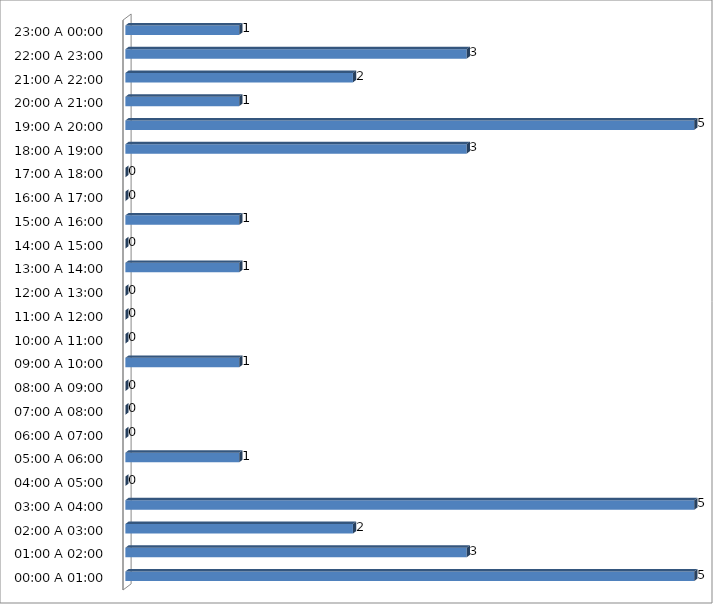
| Category | Series 0 |
|---|---|
| 00:00 A 01:00 | 5 |
| 01:00 A 02:00 | 3 |
| 02:00 A 03:00 | 2 |
| 03:00 A 04:00 | 5 |
| 04:00 A 05:00 | 0 |
| 05:00 A 06:00 | 1 |
| 06:00 A 07:00 | 0 |
| 07:00 A 08:00 | 0 |
| 08:00 A 09:00 | 0 |
| 09:00 A 10:00 | 1 |
| 10:00 A 11:00 | 0 |
| 11:00 A 12:00 | 0 |
| 12:00 A 13:00 | 0 |
| 13:00 A 14:00 | 1 |
| 14:00 A 15:00 | 0 |
| 15:00 A 16:00 | 1 |
| 16:00 A 17:00 | 0 |
| 17:00 A 18:00 | 0 |
| 18:00 A 19:00 | 3 |
| 19:00 A 20:00 | 5 |
| 20:00 A 21:00 | 1 |
| 21:00 A 22:00 | 2 |
| 22:00 A 23:00 | 3 |
| 23:00 A 00:00 | 1 |